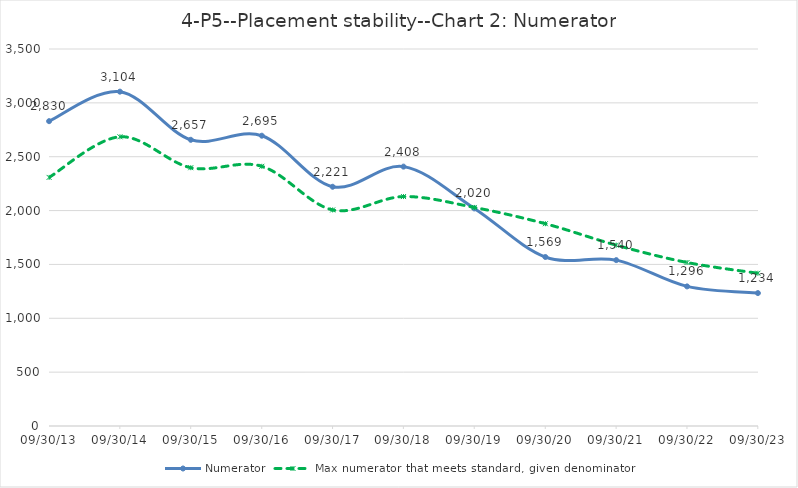
| Category | Numerator | Max numerator that meets standard, given denominator |
|---|---|---|
| 2013-09-30 | 2830 | 2308 |
| 2014-09-30 | 3104 | 2685 |
| 2015-09-30 | 2657 | 2398 |
| 2016-09-30 | 2695 | 2411 |
| 2017-09-30 | 2221 | 2006 |
| 2018-09-30 | 2408 | 2130 |
| 2019-09-30 | 2020 | 2029 |
| 2020-09-30 | 1569 | 1878 |
| 2021-09-30 | 1540 | 1679 |
| 2022-09-30 | 1296 | 1518 |
| 2023-09-30 | 1234 | 1418 |